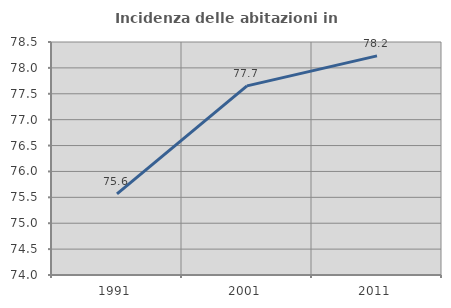
| Category | Incidenza delle abitazioni in proprietà  |
|---|---|
| 1991.0 | 75.566 |
| 2001.0 | 77.653 |
| 2011.0 | 78.232 |